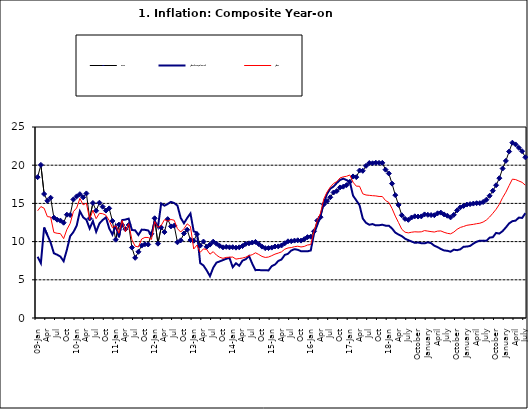
| Category | Food | All Items less Farm Produce | All Items |
|---|---|---|---|
| 09-Jan | 18.436 | 8.013 | 14.034 |
| Feb | 20.041 | 7.178 | 14.584 |
| Mar | 16.233 | 11.842 | 14.366 |
| Apr | 15.342 | 10.85 | 13.268 |
| May | 15.74 | 9.88 | 13.212 |
| June | 13.138 | 8.472 | 11.194 |
| Jul | 12.867 | 8.285 | 11.09 |
| Aug | 12.746 | 8.044 | 11.046 |
| Sep | 12.472 | 7.431 | 10.39 |
| Oct | 13.524 | 8.933 | 11.588 |
| Nov | 13.482 | 10.702 | 12.368 |
| Dec | 15.518 | 11.249 | 13.93 |
| 10-Jan | 15.918 | 12.063 | 14.398 |
| Feb | 16.208 | 13.978 | 15.649 |
| Mar | 15.79 | 13.184 | 14.812 |
| Apr | 16.306 | 12.844 | 15.044 |
| May | 13.023 | 11.711 | 12.915 |
| Jun | 15.053 | 12.686 | 14.099 |
| Jul | 14.043 | 11.287 | 13.002 |
| Aug | 15.09 | 12.366 | 13.702 |
| Sep | 14.57 | 12.83 | 13.65 |
| Oct | 14.065 | 13.168 | 13.45 |
| Nov | 14.351 | 11.746 | 12.766 |
| Dec | 12.701 | 10.917 | 11.815 |
| 11-Jan | 10.255 | 12.118 | 12.08 |
| Feb | 12.221 | 10.569 | 11.1 |
| Mar | 12.169 | 12.815 | 12.779 |
| Apr | 11.629 | 12.882 | 11.291 |
| May | 12.179 | 13.006 | 12.352 |
| Jun | 9.22 | 11.524 | 10.23 |
| Jul | 7.877 | 11.472 | 9.397 |
| Aug | 8.665 | 10.863 | 9.301 |
| Sep | 9.479 | 11.567 | 10.339 |
| Oct | 9.656 | 11.539 | 10.544 |
| Nov | 9.623 | 11.459 | 10.54 |
| Dec | 11.02 | 10.822 | 10.283 |
| 12-Jan | 13.053 | 12.748 | 12.626 |
| 12-Feb | 9.729 | 11.901 | 11.866 |
| 12-Mar | 11.848 | 14.995 | 12.111 |
| Apr | 11.246 | 14.703 | 12.866 |
| May | 12.942 | 14.926 | 12.688 |
| Jun | 11.991 | 15.199 | 12.892 |
| Jul | 12.093 | 15.045 | 12.797 |
| Aug | 9.91 | 14.714 | 11.689 |
| Sep | 10.164 | 13.101 | 11.253 |
| Oct | 11.064 | 12.398 | 11.693 |
| Nov | 11.553 | 13.092 | 12.32 |
| Dec | 10.199 | 13.685 | 11.981 |
| 13-Jan | 10.106 | 11.342 | 9.031 |
| Feb | 10.973 | 11.184 | 9.542 |
| Mar | 9.482 | 7.179 | 8.593 |
| Apr | 10.006 | 6.874 | 9.052 |
| May | 9.321 | 6.227 | 8.964 |
| Jun | 9.606 | 5.472 | 8.353 |
| Jul | 9.994 | 6.58 | 8.682 |
| Aug | 9.723 | 7.245 | 8.231 |
| Sep | 9.437 | 7.41 | 7.952 |
| Oct | 9.249 | 7.579 | 7.807 |
| Nov | 9.313 | 7.75 | 7.931 |
| Dec | 9.253 | 7.872 | 7.957 |
| 14-Jan | 9.271 | 6.648 | 7.977 |
| Feb | 9.207 | 7.166 | 7.707 |
| Mar | 9.254 | 6.836 | 7.783 |
| Apr | 9.414 | 7.508 | 7.851 |
| May | 9.698 | 7.693 | 7.965 |
| Jun | 9.776 | 8.122 | 8.167 |
| Jul | 9.878 | 7.116 | 8.281 |
| Aug | 9.959 | 6.264 | 8.534 |
| Sep | 9.676 | 6.278 | 8.317 |
| Oct | 9.343 | 6.252 | 8.06 |
| Nov | 9.144 | 6.255 | 7.927 |
| Dec | 9.152 | 6.225 | 7.978 |
| 15-Jan | 9.215 | 6.787 | 8.157 |
| Feb | 9.359 | 6.994 | 8.359 |
| Mar | 9.376 | 7.46 | 8.494 |
| Apr | 9.49 | 7.661 | 8.655 |
| May | 9.782 | 8.253 | 9.003 |
| Jun | 10.041 | 8.403 | 9.168 |
| Jul | 10.049 | 8.83 | 9.218 |
| Aug | 10.131 | 9.01 | 9.336 |
| Sep | 10.174 | 8.928 | 9.394 |
| Oct | 10.129 | 8.742 | 9.296 |
| Nov | 10.321 | 8.732 | 9.368 |
| Dec | 10.588 | 8.727 | 9.554 |
| 16-Jan | 10.642 | 8.841 | 9.617 |
| Feb | 11.348 | 11.041 | 11.379 |
| Mar | 12.745 | 12.17 | 12.775 |
| Apr | 13.194 | 13.352 | 13.721 |
| May | 14.861 | 15.054 | 15.577 |
| Jun | 15.302 | 16.224 | 16.48 |
| Jul | 15.799 | 16.929 | 17.127 |
| Aug | 16.427 | 17.208 | 17.609 |
| Sep | 16.622 | 17.666 | 17.852 |
| Oct | 17.09 | 18.067 | 18.33 |
| Nov | 17.191 | 18.241 | 18.476 |
| Dec | 17.388 | 18.052 | 18.547 |
| 17-Jan | 17.818 | 17.867 | 18.719 |
| Feb | 18.528 | 16.011 | 17.78 |
| Mar | 18.436 | 15.404 | 17.256 |
| Apr | 19.303 | 14.75 | 17.244 |
| May | 19.266 | 13.016 | 16.251 |
| Jun | 19.915 | 12.455 | 16.098 |
| Jul | 20.284 | 12.207 | 16.053 |
| Aug | 20.251 | 12.296 | 16.012 |
| Sep | 20.321 | 12.123 | 15.979 |
| Oct | 20.306 | 12.142 | 15.905 |
| Nov | 20.308 | 12.206 | 15.901 |
| Dec | 19.415 | 12.089 | 15.372 |
| 18-Jan | 18.919 | 12.09 | 15.127 |
| Feb | 17.588 | 11.707 | 14.33 |
| Mar | 16.08 | 11.181 | 13.337 |
| Apr | 14.799 | 10.92 | 12.482 |
| May | 13.448 | 10.71 | 11.608 |
| June | 12.977 | 10.387 | 11.231 |
| July | 12.85 | 10.183 | 11.142 |
| August | 13.158 | 10.015 | 11.227 |
| September | 13.309 | 9.838 | 11.284 |
| October | 13.277 | 9.882 | 11.259 |
| November | 13.301 | 9.787 | 11.281 |
| December | 13.559 | 9.771 | 11.442 |
| January | 13.505 | 9.91 | 11.374 |
| February | 13.473 | 9.8 | 11.306 |
| March | 13.451 | 9.461 | 11.251 |
| April | 13.701 | 9.28 | 11.372 |
| May | 13.794 | 9.033 | 11.396 |
| June | 13.558 | 8.841 | 11.217 |
| July | 13.392 | 8.798 | 11.084 |
| August | 13.17 | 8.678 | 11.016 |
| September | 13.507 | 8.945 | 11.244 |
| October | 14.088 | 8.876 | 11.607 |
| November | 14.482 | 8.993 | 11.854 |
| December | 14.667 | 9.331 | 11.982 |
| January | 14.849 | 9.349 | 12.132 |
| February | 14.904 | 9.434 | 12.199 |
| March | 14.977 | 9.732 | 12.257 |
| April | 15.026 | 9.979 | 12.341 |
| May | 15.036 | 10.12 | 12.404 |
| June | 15.175 | 10.128 | 12.559 |
| July | 15.482 | 10.102 | 12.821 |
| August | 15.996 | 10.521 | 13.22 |
| September | 16.66 | 10.581 | 13.707 |
| October | 17.378 | 11.137 | 14.233 |
| November | 18.298 | 11.05 | 14.887 |
| December | 19.562 | 11.374 | 15.753 |
| January | 20.567 | 11.854 | 16.466 |
| February | 21.786 | 12.382 | 17.335 |
| March | 22.948 | 12.673 | 18.171 |
| April | 22.719 | 12.743 | 18.117 |
| May | 22.277 | 13.145 | 17.933 |
| June | 21.829 | 13.094 | 17.751 |
| July | 21.032 | 13.72 | 17.377 |